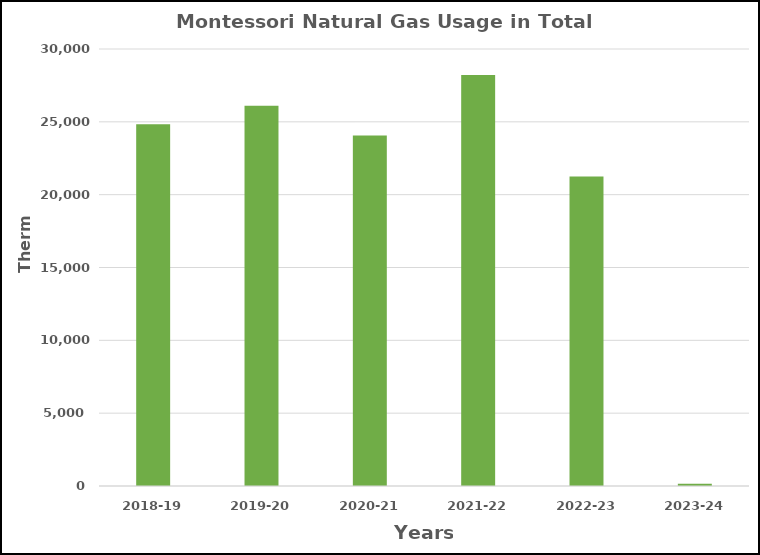
| Category | Series 0 |
|---|---|
| 2018-19 | 24841 |
| 2019-20 | 26098 |
| 2020-21 | 24062 |
| 2021-22 | 28221 |
| 2022-23 | 21247 |
| 2023-24 | 160 |